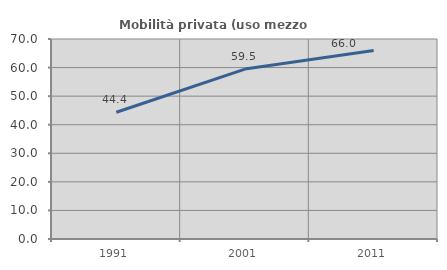
| Category | Mobilità privata (uso mezzo privato) |
|---|---|
| 1991.0 | 44.352 |
| 2001.0 | 59.48 |
| 2011.0 | 65.956 |